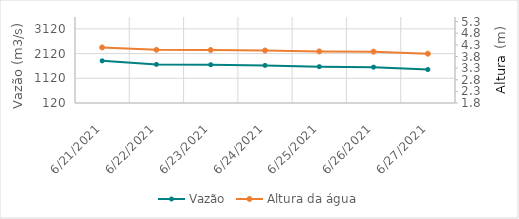
| Category | Vazão |
|---|---|
| 5/25/21 | 2351.09 |
| 5/24/21 | 2551.13 |
| 5/23/21 | 2833.42 |
| 5/22/21 | 3129.19 |
| 5/21/21 | 3396.63 |
| 5/20/21 | 3535.09 |
| 5/19/21 | 3496.98 |